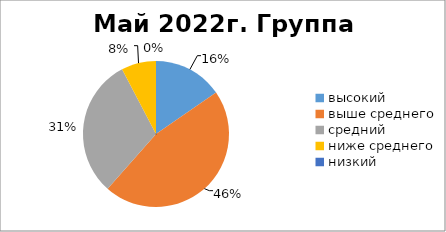
| Category | Series 0 |
|---|---|
| высокий | 2 |
| выше среднего | 6 |
| средний | 4 |
| ниже среднего | 1 |
| низкий | 0 |